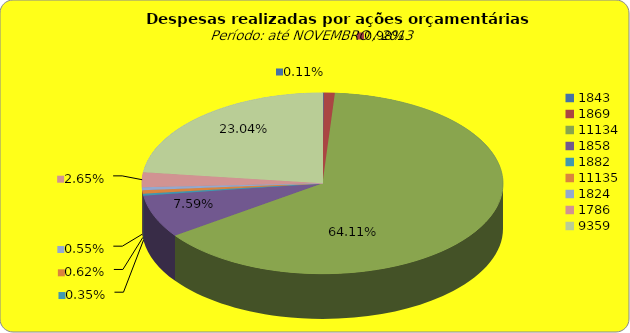
| Category | Series 1 |
|---|---|
| 1843.0 | 161802.31 |
| 1869.0 | 1441640.54 |
| 11134.0 | 94127470.53 |
| 1858.0 | 11144681.01 |
| 1882.0 | 519790.22 |
| 11135.0 | 905373.99 |
| 1824.0 | 806188.23 |
| 1786.0 | 3893950.48 |
| 9359.0 | 33825800.67 |